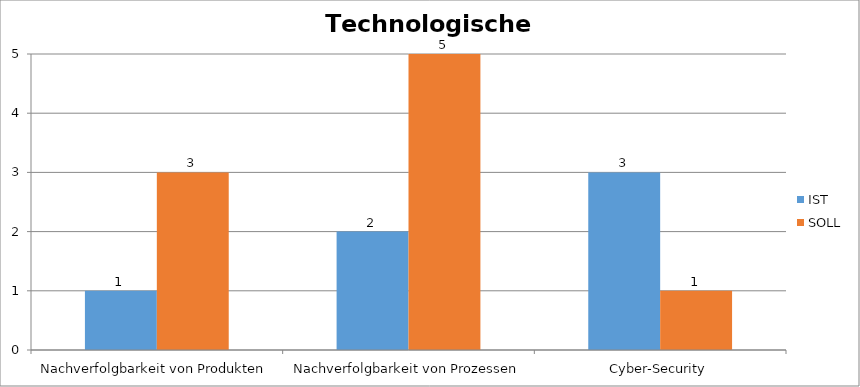
| Category | IST | SOLL |
|---|---|---|
| Nachverfolgbarkeit von Produkten | 1 | 3 |
| Nachverfolgbarkeit von Prozessen | 2 | 5 |
| Cyber-Security | 3 | 1 |